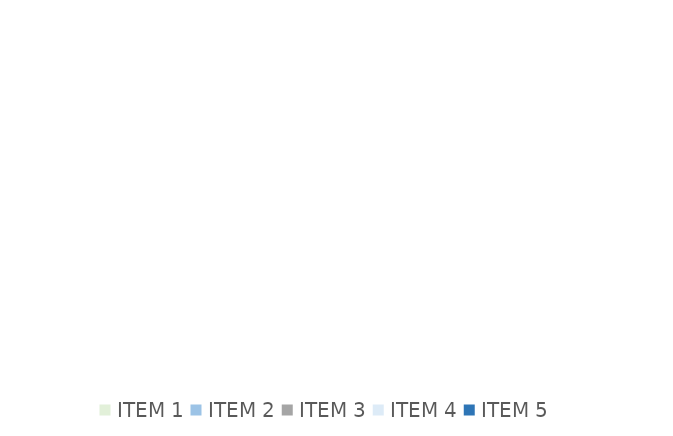
| Category | Series 0 |
|---|---|
| ITEM 1 | 0 |
| ITEM 2 | 0 |
| ITEM 3 | 0 |
| ITEM 4 | 0 |
| ITEM 5 | 0 |